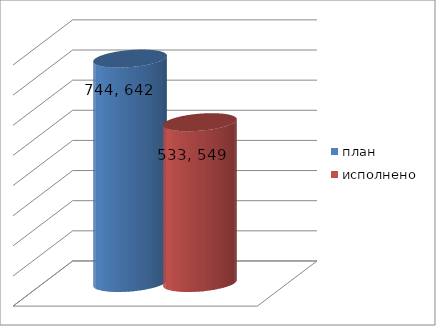
| Category | план | исполнено |
|---|---|---|
| 0 | 744642583.33 | 533549587.43 |